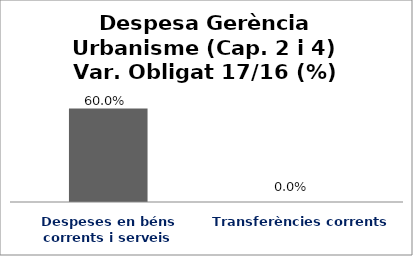
| Category | Series 0 |
|---|---|
| Despeses en béns corrents i serveis | 0.6 |
| Transferències corrents | 0 |